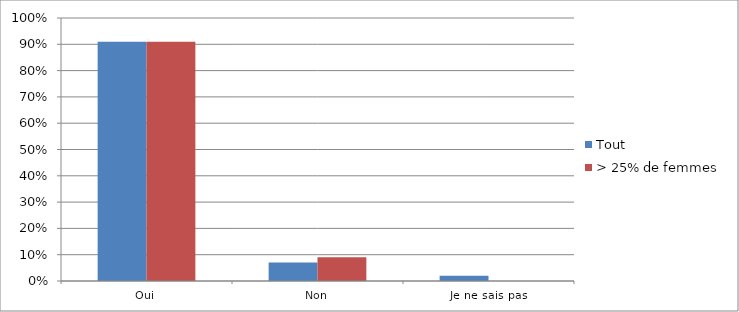
| Category | Tout | > 25% de femmes |
|---|---|---|
| Oui | 0.91 | 0.91 |
| Non | 0.07 | 0.09 |
| Je ne sais pas | 0.02 | 0 |